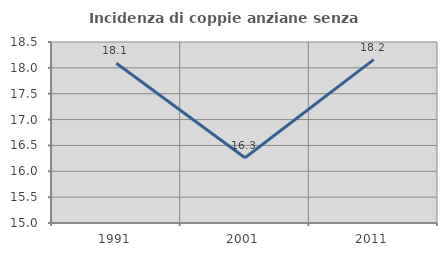
| Category | Incidenza di coppie anziane senza figli  |
|---|---|
| 1991.0 | 18.088 |
| 2001.0 | 16.262 |
| 2011.0 | 18.159 |